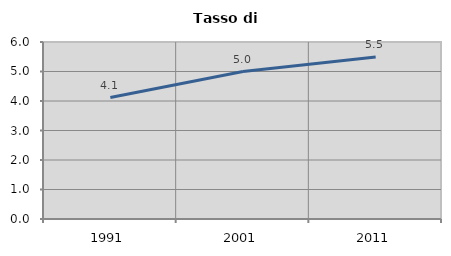
| Category | Tasso di disoccupazione   |
|---|---|
| 1991.0 | 4.118 |
| 2001.0 | 5 |
| 2011.0 | 5.495 |